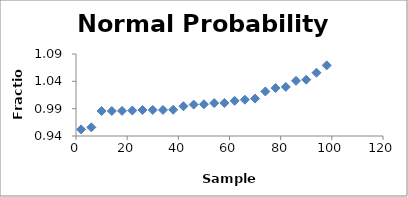
| Category | Series 0 |
|---|---|
| 2.0 | 0.952 |
| 6.0 | 0.956 |
| 10.0 | 0.986 |
| 14.0 | 0.986 |
| 18.0 | 0.986 |
| 22.0 | 0.987 |
| 26.0 | 0.988 |
| 30.0 | 0.988 |
| 34.0 | 0.988 |
| 38.0 | 0.988 |
| 42.0 | 0.994 |
| 46.0 | 0.997 |
| 50.0 | 0.998 |
| 54.0 | 1 |
| 58.0 | 1 |
| 62.0 | 1.004 |
| 66.0 | 1.006 |
| 70.0 | 1.008 |
| 74.0 | 1.021 |
| 78.0 | 1.028 |
| 82.0 | 1.03 |
| 86.0 | 1.041 |
| 90.0 | 1.043 |
| 94.0 | 1.056 |
| 98.0 | 1.069 |